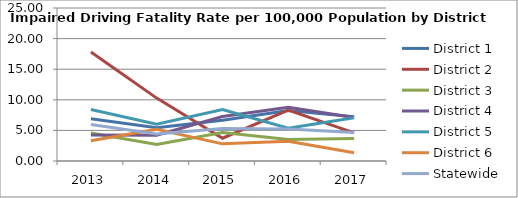
| Category | District 1 | District 2 | District 3 | District 4 | District 5 | District 6 | Statewide |
|---|---|---|---|---|---|---|---|
| 2013.0 | 6.895 | 17.826 | 4.568 | 4.236 | 8.427 | 3.325 | 5.955 |
| 2014.0 | 5.42 | 10.277 | 2.713 | 4.2 | 6.016 | 5.183 | 4.405 |
| 2015.0 | 6.666 | 3.725 | 4.669 | 7.277 | 8.412 | 2.802 | 5.317 |
| 2016.0 | 8.258 | 8.328 | 3.529 | 8.765 | 5.363 | 3.208 | 5.228 |
| 2017.0 | 7.239 | 4.607 | 3.695 | 7.117 | 7.065 | 1.35 | 4.659 |